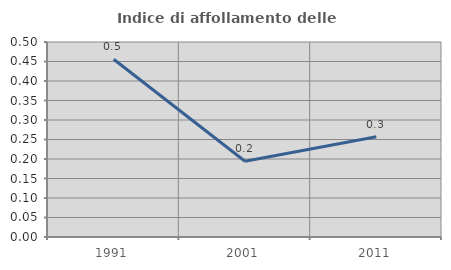
| Category | Indice di affollamento delle abitazioni  |
|---|---|
| 1991.0 | 0.456 |
| 2001.0 | 0.194 |
| 2011.0 | 0.257 |